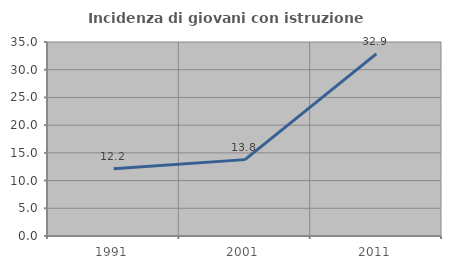
| Category | Incidenza di giovani con istruzione universitaria |
|---|---|
| 1991.0 | 12.153 |
| 2001.0 | 13.779 |
| 2011.0 | 32.868 |